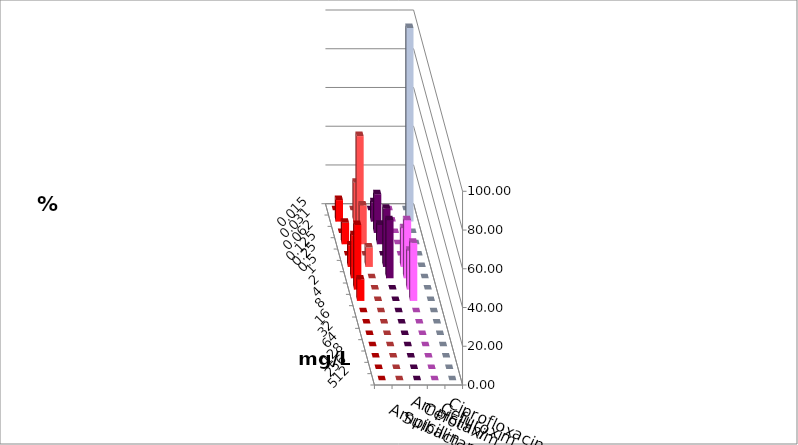
| Category | Ampicillin | Ampicillin/ Sulbactam | Cefotaxim | Cefuroxim | Ciprofloxacin |
|---|---|---|---|---|---|
| 0.015 | 0 | 0 | 0 | 0 | 0 |
| 0.031 | 11.111 | 20 | 10 | 0 | 100 |
| 0.062 | 0 | 50 | 20 | 0 | 0 |
| 0.125 | 11.111 | 20 | 10 | 0 | 0 |
| 0.25 | 0 | 0 | 0 | 0 | 0 |
| 0.5 | 11.111 | 10 | 30 | 20 | 0 |
| 1.0 | 22.222 | 0 | 30 | 30 | 0 |
| 2.0 | 33.333 | 0 | 0 | 20 | 0 |
| 4.0 | 11.111 | 0 | 0 | 30 | 0 |
| 8.0 | 0 | 0 | 0 | 0 | 0 |
| 16.0 | 0 | 0 | 0 | 0 | 0 |
| 32.0 | 0 | 0 | 0 | 0 | 0 |
| 64.0 | 0 | 0 | 0 | 0 | 0 |
| 128.0 | 0 | 0 | 0 | 0 | 0 |
| 256.0 | 0 | 0 | 0 | 0 | 0 |
| 512.0 | 0 | 0 | 0 | 0 | 0 |